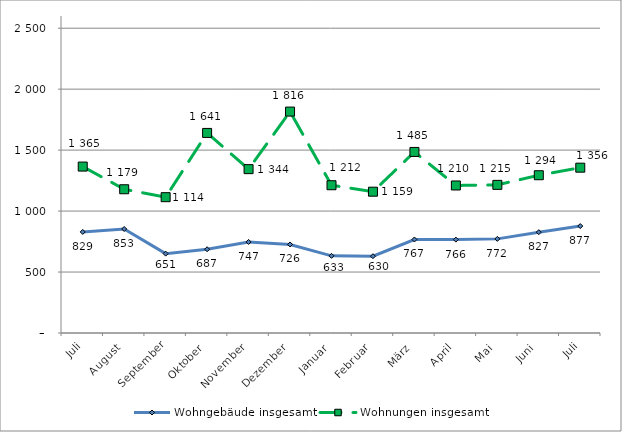
| Category | Wohngebäude insgesamt | Wohnungen insgesamt |
|---|---|---|
| Juli | 829 | 1365 |
| August | 853 | 1179 |
| September | 651 | 1114 |
| Oktober | 687 | 1641 |
| November | 747 | 1344 |
| Dezember | 726 | 1816 |
| Januar | 633 | 1212 |
| Februar | 630 | 1159 |
| März | 767 | 1485 |
| April | 766 | 1210 |
| Mai | 772 | 1215 |
| Juni | 827 | 1294 |
| Juli | 877 | 1356 |